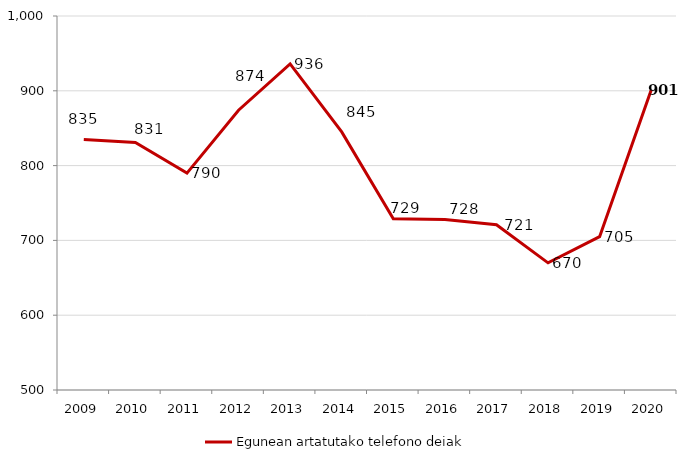
| Category | Egunean artatutako telefono deiak |
|---|---|
| 2009.0 | 835 |
| 2010.0 | 831 |
| 2011.0 | 790 |
| 2012.0 | 874 |
| 2013.0 | 936 |
| 2014.0 | 845 |
| 2015.0 | 729 |
| 2016.0 | 728 |
| 2017.0 | 721 |
| 2018.0 | 670 |
| 2019.0 | 705 |
| 2020.0 | 901 |